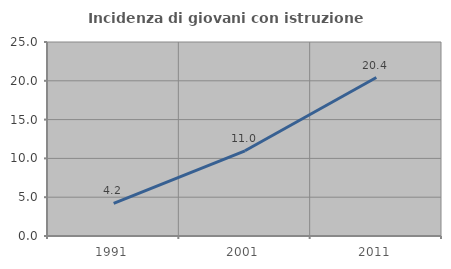
| Category | Incidenza di giovani con istruzione universitaria |
|---|---|
| 1991.0 | 4.214 |
| 2001.0 | 10.981 |
| 2011.0 | 20.421 |